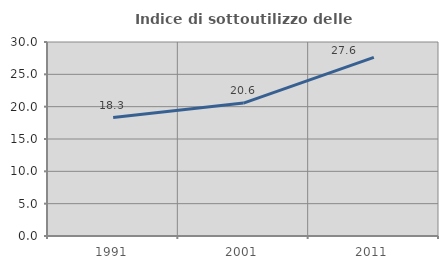
| Category | Indice di sottoutilizzo delle abitazioni  |
|---|---|
| 1991.0 | 18.314 |
| 2001.0 | 20.561 |
| 2011.0 | 27.632 |